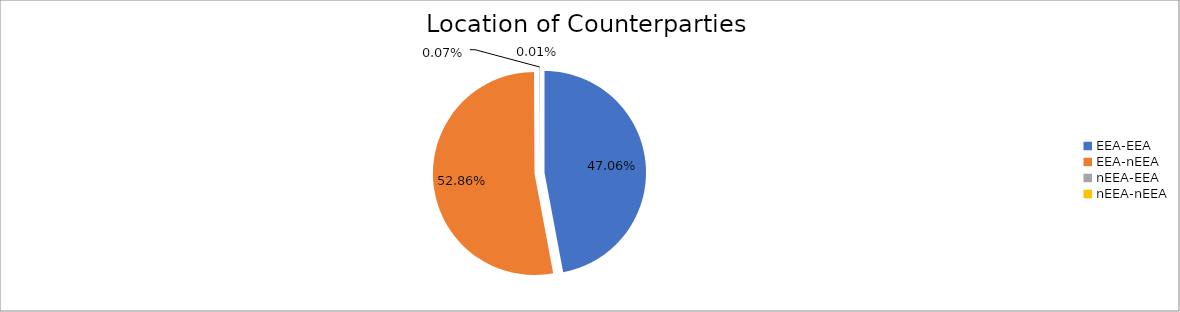
| Category | Series 0 |
|---|---|
| EEA-EEA | 6184255.497 |
| EEA-nEEA | 6947390.4 |
| nEEA-EEA | 9631.129 |
| nEEA-nEEA | 705.887 |